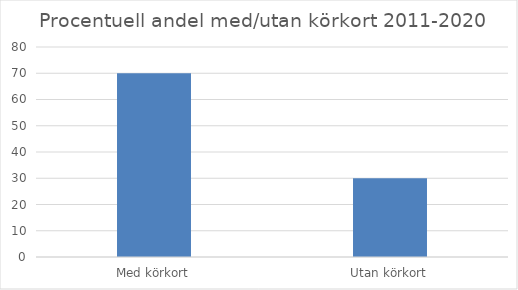
| Category | Andel % |
|---|---|
| Med körkort | 70 |
| Utan körkort | 30 |